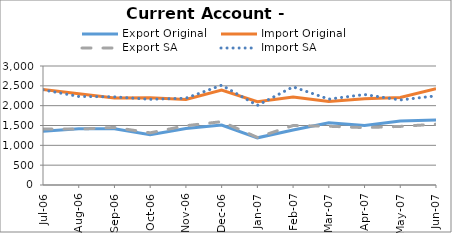
| Category | Export Original | Import Original | Export SA | Import SA |
|---|---|---|---|---|
| 2006-07-31 | 1357 | 2408 | 1412 | 2399 |
| 2006-08-31 | 1419 | 2302 | 1409 | 2233 |
| 2006-09-30 | 1416 | 2196 | 1451 | 2222 |
| 2006-10-31 | 1268 | 2197 | 1316 | 2160 |
| 2006-11-30 | 1426 | 2154 | 1494 | 2188 |
| 2006-12-31 | 1511 | 2391 | 1597 | 2516 |
| 2007-01-31 | 1189 | 2099 | 1200 | 2007 |
| 2007-02-28 | 1388 | 2218 | 1499 | 2474 |
| 2007-03-31 | 1571 | 2103 | 1481 | 2165 |
| 2007-04-30 | 1499 | 2175 | 1446 | 2281 |
| 2007-05-31 | 1616 | 2204 | 1477 | 2144 |
| 2007-06-30 | 1641 | 2426 | 1533 | 2247 |